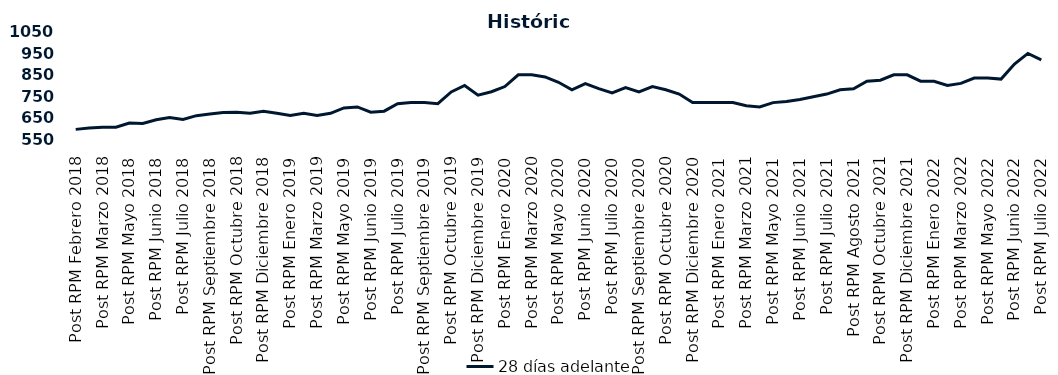
| Category | 28 días adelante |
|---|---|
| Post RPM Febrero 2018 | 595 |
| Pre RPM Marzo 2018 | 601 |
| Post RPM Marzo 2018 | 605 |
| Pre RPM Mayo 2018 | 605 |
| Post RPM Mayo 2018 | 625 |
| Pre RPM Junio 2018 | 623 |
| Post RPM Junio 2018 | 640 |
| Pre RPM Julio 2018 | 650 |
| Post RPM Julio 2018 | 641 |
| Pre RPM Septiembre 2018 | 659 |
| Post RPM Septiembre 2018 | 666.75 |
| Pre RPM Octubre 2018 | 674 |
| Post RPM Octubre 2018 | 675 |
| Pre RPM Diciembre 2018 | 670 |
| Post RPM Diciembre 2018 | 680 |
| Pre RPM Enero 2019 | 670 |
| Post RPM Enero 2019 | 660 |
| Pre RPM Marzo 2019 | 670 |
| Post RPM Marzo 2019 | 660 |
| Pre RPM Mayo 2019 | 670 |
| Post RPM Mayo 2019 | 695 |
| Pre RPM Junio 2019 | 700 |
| Post RPM Junio 2019 | 675 |
| Pre RPM Julio 2019 | 680 |
| Post RPM Julio 2019 | 715 |
| Pre RPM Septiembre 2019 | 720 |
| Post RPM Septiembre 2019 | 720 |
| Pre RPM Octubre 2019 | 715 |
| Post RPM Octubre 2019 | 770 |
| Pre RPM Diciembre 2019 | 800 |
| Post RPM Diciembre 2019 | 755 |
| Pre RPM Enero 2020 | 771 |
| Post RPM Enero 2020 | 795 |
| Pre RPM Marzo 2020 | 850 |
| Post RPM Marzo 2020 | 850 |
| Pre RPM Mayo 2020 | 840 |
| Post RPM Mayo 2020 | 815 |
| Pre RPM Junio 2020 | 780 |
| Post RPM Junio 2020 | 809 |
| Pre RPM Julio 2020 | 785.72 |
| Post RPM Julio 2020 | 765 |
| Pre RPM Septiembre 2020 | 790 |
| Post RPM Septiembre 2020 | 770 |
| Pre RPM Octubre 2020 | 795 |
| Post RPM Octubre 2020 | 780 |
| Pre RPM Diciembre 2020 | 760 |
| Post RPM Diciembre 2020 | 720 |
| Pre RPM Enero 2021 | 720 |
| Post RPM Enero 2021 | 720 |
| Pre RPM Marzo 2021 | 720 |
| Post RPM Marzo 2021 | 705 |
| Pre RPM Mayo 2021 | 700 |
| Post RPM Mayo 2021 | 720 |
| Pre RPM Junio 2021 | 725 |
| Post RPM Junio 2021 | 735 |
| Pre RPM Julio 2021 | 747.5 |
| Post RPM Julio 2021 | 760 |
| Pre RPM Agosto 2021 | 780 |
| Post RPM Agosto 2021 | 785 |
| Pre RPM Octubre 2021 | 820 |
| Post RPM Octubre 2021 | 825 |
| Pre RPM Diciembre 2021 | 850 |
| Post RPM Diciembre 2021 | 850 |
| Pre RPM Enero 2022 | 820 |
| Post RPM Enero 2022 | 820 |
| Pre RPM Marzo 2022 | 800 |
| Post RPM Marzo 2022 | 810 |
| Pre RPM Mayo 2022 | 835 |
| Post RPM Mayo 2022 | 835 |
| Pre RPM Junio 2022 | 830 |
| Post RPM Junio 2022 | 900 |
| Pre RPM Julio 2022 | 950 |
| Post RPM Julio 2022 | 920 |